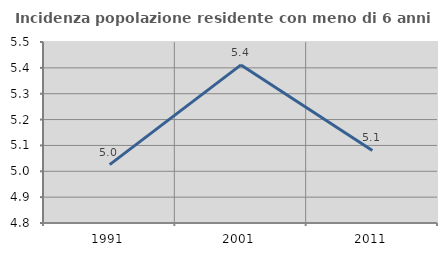
| Category | Incidenza popolazione residente con meno di 6 anni |
|---|---|
| 1991.0 | 5.026 |
| 2001.0 | 5.411 |
| 2011.0 | 5.081 |